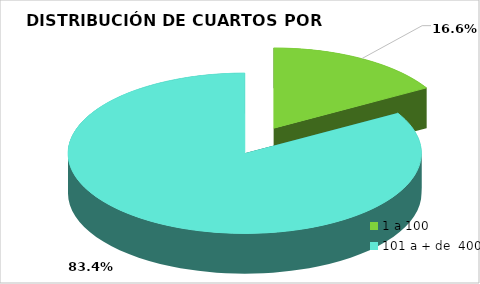
| Category | RANGO |
|---|---|
| 1 a 100 | 0.166 |
| 101 a + de  400 | 0.834 |